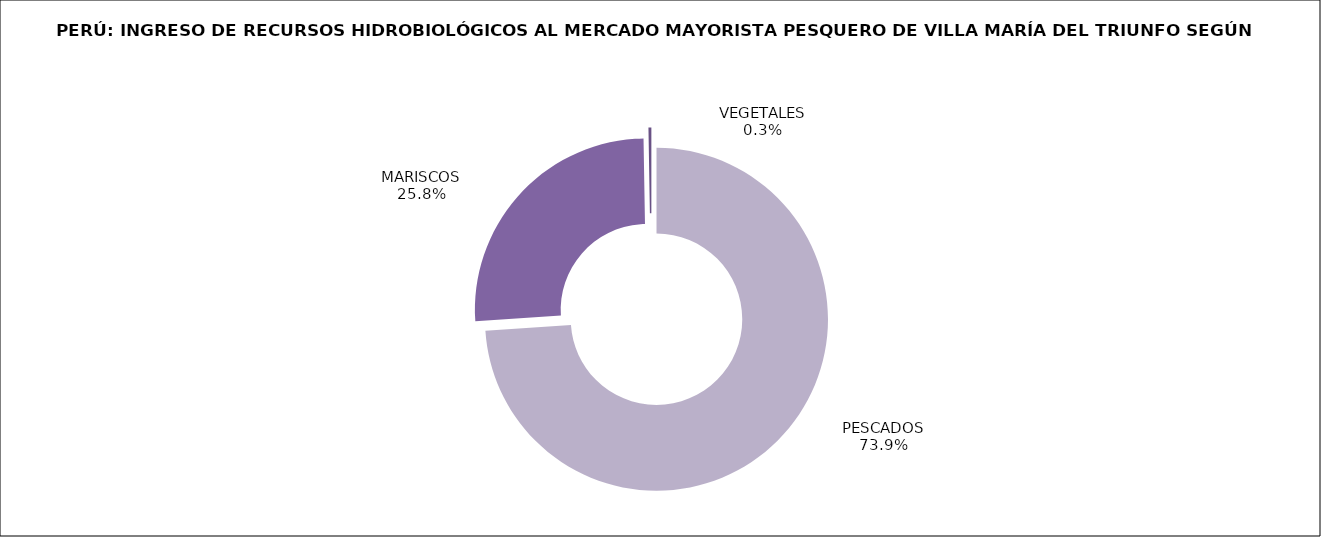
| Category | Series 0 |
|---|---|
| PESCADOS | 60936.357 |
| MARISCOS | 21258.356 |
| VEGETALES | 223.8 |